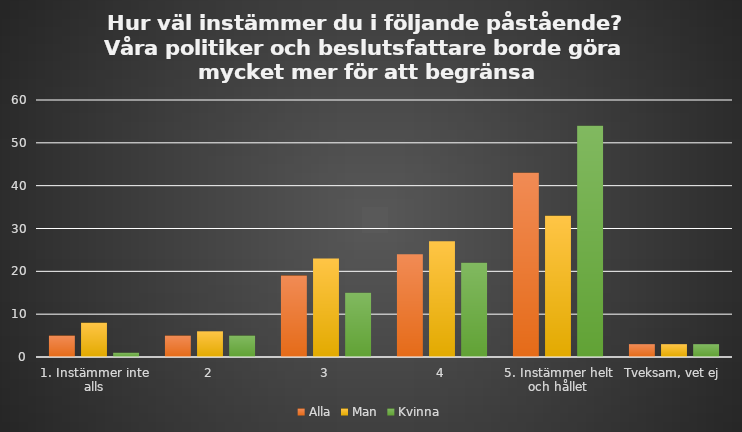
| Category | Alla | Man | Kvinna |
|---|---|---|---|
| 1. Instämmer inte alls | 5 | 8 | 1 |
| 2 | 5 | 6 | 5 |
| 3 | 19 | 23 | 15 |
| 4 | 24 | 27 | 22 |
| 5. Instämmer helt och hållet | 43 | 33 | 54 |
| Tveksam, vet ej | 3 | 3 | 3 |